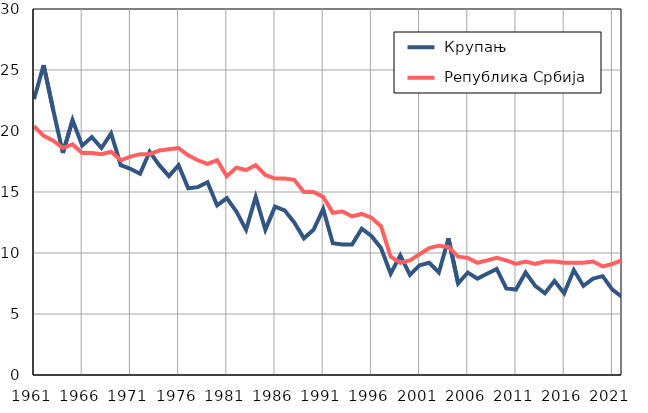
| Category |  Крупањ |  Република Србија |
|---|---|---|
| 1961.0 | 22.6 | 20.4 |
| 1962.0 | 25.4 | 19.6 |
| 1963.0 | 21.7 | 19.2 |
| 1964.0 | 18.2 | 18.6 |
| 1965.0 | 20.9 | 18.9 |
| 1966.0 | 18.8 | 18.2 |
| 1967.0 | 19.5 | 18.2 |
| 1968.0 | 18.6 | 18.1 |
| 1969.0 | 19.8 | 18.3 |
| 1970.0 | 17.2 | 17.6 |
| 1971.0 | 16.9 | 17.9 |
| 1972.0 | 16.5 | 18.1 |
| 1973.0 | 18.3 | 18.1 |
| 1974.0 | 17.2 | 18.4 |
| 1975.0 | 16.3 | 18.5 |
| 1976.0 | 17.2 | 18.6 |
| 1977.0 | 15.3 | 18 |
| 1978.0 | 15.4 | 17.6 |
| 1979.0 | 15.8 | 17.3 |
| 1980.0 | 13.9 | 17.6 |
| 1981.0 | 14.5 | 16.3 |
| 1982.0 | 13.4 | 17 |
| 1983.0 | 11.9 | 16.8 |
| 1984.0 | 14.6 | 17.2 |
| 1985.0 | 11.9 | 16.4 |
| 1986.0 | 13.8 | 16.1 |
| 1987.0 | 13.5 | 16.1 |
| 1988.0 | 12.5 | 16 |
| 1989.0 | 11.2 | 15 |
| 1990.0 | 11.9 | 15 |
| 1991.0 | 13.6 | 14.6 |
| 1992.0 | 10.8 | 13.3 |
| 1993.0 | 10.7 | 13.4 |
| 1994.0 | 10.7 | 13 |
| 1995.0 | 12 | 13.2 |
| 1996.0 | 11.4 | 12.9 |
| 1997.0 | 10.4 | 12.2 |
| 1998.0 | 8.3 | 9.7 |
| 1999.0 | 9.8 | 9.2 |
| 2000.0 | 8.2 | 9.4 |
| 2001.0 | 9 | 9.9 |
| 2002.0 | 9.2 | 10.4 |
| 2003.0 | 8.4 | 10.6 |
| 2004.0 | 11.2 | 10.5 |
| 2005.0 | 7.5 | 9.7 |
| 2006.0 | 8.4 | 9.6 |
| 2007.0 | 7.9 | 9.2 |
| 2008.0 | 8.3 | 9.4 |
| 2009.0 | 8.7 | 9.6 |
| 2010.0 | 7.1 | 9.4 |
| 2011.0 | 7 | 9.1 |
| 2012.0 | 8.4 | 9.3 |
| 2013.0 | 7.3 | 9.1 |
| 2014.0 | 6.7 | 9.3 |
| 2015.0 | 7.7 | 9.3 |
| 2016.0 | 6.7 | 9.2 |
| 2017.0 | 8.6 | 9.2 |
| 2018.0 | 7.3 | 9.2 |
| 2019.0 | 7.9 | 9.3 |
| 2020.0 | 8.1 | 8.9 |
| 2021.0 | 7 | 9.1 |
| 2022.0 | 6.4 | 9.4 |